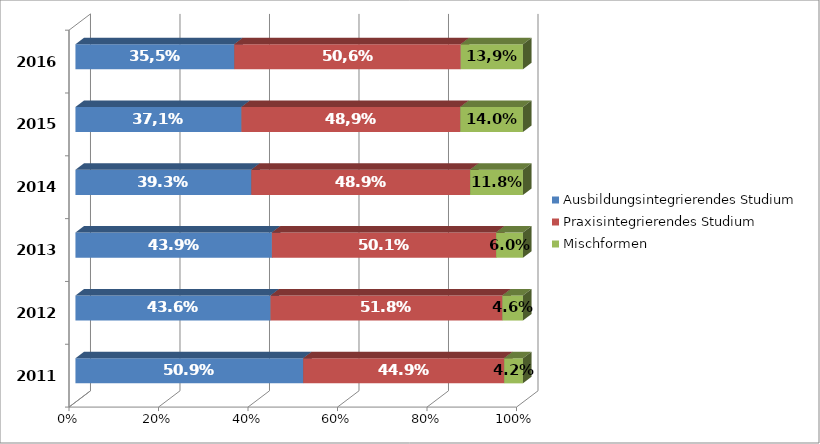
| Category | Ausbildungsintegrierendes Studium | Praxisintegrierendes Studium | Mischformen |
|---|---|---|---|
| 2011.0 | 0.509 | 0.449 | 0.042 |
| 2012.0 | 0.436 | 0.518 | 0.046 |
| 2013.0 | 0.439 | 0.501 | 0.06 |
| 2014.0 | 0.393 | 0.489 | 0.118 |
| 2015.0 | 0.371 | 0.489 | 0.14 |
| 2016.0 | 0.355 | 0.506 | 0.139 |